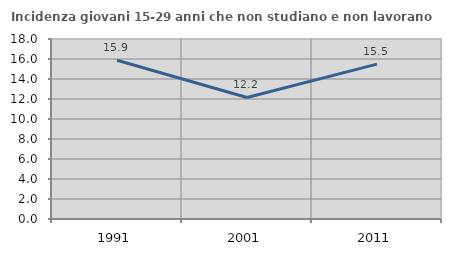
| Category | Incidenza giovani 15-29 anni che non studiano e non lavorano  |
|---|---|
| 1991.0 | 15.871 |
| 2001.0 | 12.15 |
| 2011.0 | 15.491 |